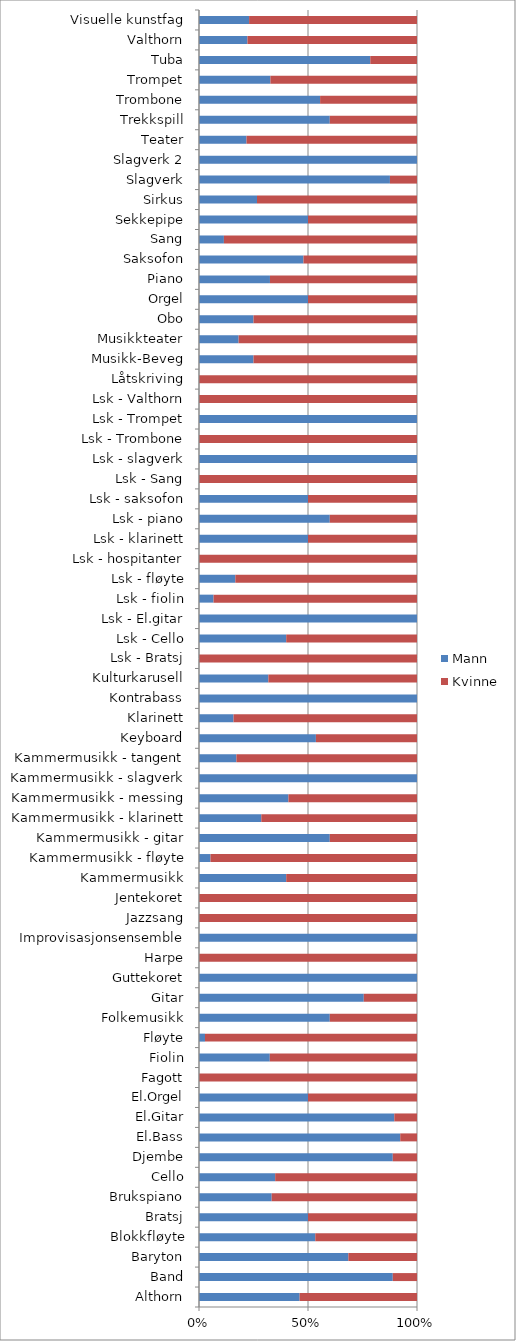
| Category | Mann | Kvinne |
|---|---|---|
| Althorn | 6 | 7 |
| Band | 32 | 4 |
| Baryton | 37 | 17 |
| Blokkfløyte | 8 | 7 |
| Bratsj | 4 | 4 |
| Brukspiano | 4 | 8 |
| Cello | 29 | 54 |
| Djembe | 8 | 1 |
| El.Bass | 24 | 2 |
| El.Gitar | 129 | 15 |
| El.Orgel | 1 | 1 |
| Fagott | 0 | 1 |
| Fiolin | 114 | 237 |
| Fløyte | 4 | 142 |
| Folkemusikk | 6 | 4 |
| Gitar | 161 | 52 |
| Guttekoret | 55 | 0 |
| Harpe | 0 | 1 |
| Improvisasjonsensemble | 5 | 0 |
| Jazzsang | 0 | 6 |
| Jentekoret | 0 | 26 |
| Kammermusikk | 24 | 36 |
| Kammermusikk - fløyte | 1 | 18 |
| Kammermusikk - gitar | 3 | 2 |
| Kammermusikk - klarinett | 2 | 5 |
| Kammermusikk - messing | 16 | 23 |
| Kammermusikk - slagverk | 4 | 0 |
| Kammermusikk - tangent | 6 | 29 |
| Keyboard | 37 | 32 |
| Klarinett | 32 | 170 |
| Kontrabass | 7 | 0 |
| Kulturkarusell | 7 | 15 |
| Lsk - Bratsj | 0 | 1 |
| Lsk - Cello | 2 | 3 |
| Lsk - El.gitar | 1 | 0 |
| Lsk - fiolin | 1 | 14 |
| Lsk - fløyte | 1 | 5 |
| Lsk - hospitanter | 0 | 2 |
| Lsk - klarinett | 1 | 1 |
| Lsk - piano | 6 | 4 |
| Lsk - saksofon | 1 | 1 |
| Lsk - Sang | 0 | 3 |
| Lsk - slagverk | 1 | 0 |
| Lsk - Trombone | 0 | 2 |
| Lsk - Trompet | 1 | 0 |
| Lsk - Valthorn | 0 | 1 |
| Låtskriving | 0 | 5 |
| Musikk-Beveg | 2 | 6 |
| Musikkteater | 4 | 18 |
| Obo | 1 | 3 |
| Orgel | 3 | 3 |
| Piano | 291 | 603 |
| Saksofon | 46 | 50 |
| Sang | 28 | 217 |
| Sekkepipe | 1 | 1 |
| Sirkus | 29 | 80 |
| Slagverk | 134 | 19 |
| Slagverk 2 | 1 | 0 |
| Teater | 27 | 97 |
| Trekkspill | 3 | 2 |
| Trombone | 45 | 36 |
| Trompet | 57 | 117 |
| Tuba | 11 | 3 |
| Valthorn | 10 | 35 |
| Visuelle kunstfag | 37 | 124 |